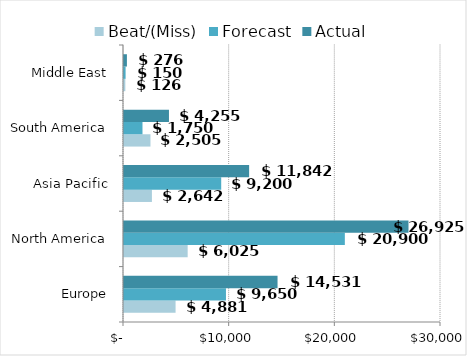
| Category | Beat/(Miss) | Forecast | Actual |
|---|---|---|---|
| Europe | 4881 | 9650 | 14531 |
| North America | 6025 | 20900 | 26925 |
| Asia Pacific | 2642 | 9200 | 11842 |
| South America | 2505 | 1750 | 4255 |
| Middle East | 126 | 150 | 276 |